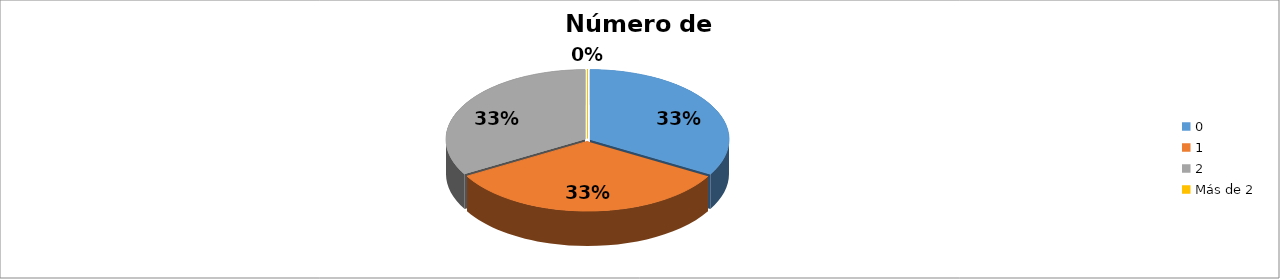
| Category | Series 0 |
|---|---|
| 0 | 0.333 |
| 1 | 0.333 |
| 2 | 0.333 |
| Más de 2 | 0 |